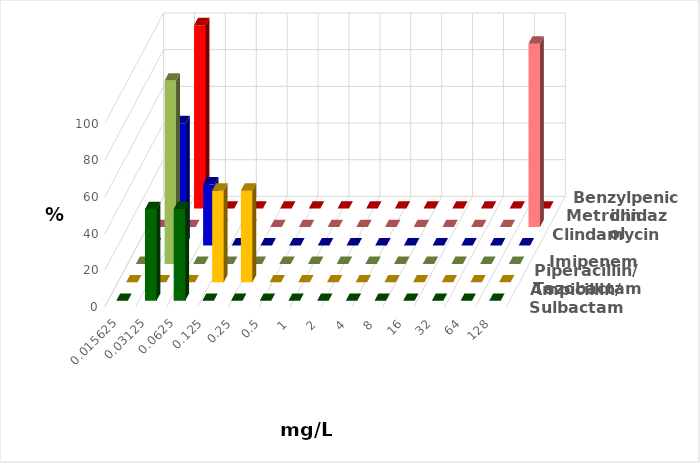
| Category | Ampicillin/ Sulbactam | Piperacillin/ Tazobactam | Imipenem | Clindamycin | Metronidazol | Benzylpenicillin |
|---|---|---|---|---|---|---|
| 0.015625 | 0 | 0 | 0 | 0 | 0 | 0 |
| 0.03125 | 50 | 0 | 100 | 66.667 | 0 | 100 |
| 0.0625 | 50 | 0 | 0 | 33.333 | 0 | 0 |
| 0.125 | 0 | 50 | 0 | 0 | 0 | 0 |
| 0.25 | 0 | 50 | 0 | 0 | 0 | 0 |
| 0.5 | 0 | 0 | 0 | 0 | 0 | 0 |
| 1.0 | 0 | 0 | 0 | 0 | 0 | 0 |
| 2.0 | 0 | 0 | 0 | 0 | 0 | 0 |
| 4.0 | 0 | 0 | 0 | 0 | 0 | 0 |
| 8.0 | 0 | 0 | 0 | 0 | 0 | 0 |
| 16.0 | 0 | 0 | 0 | 0 | 0 | 0 |
| 32.0 | 0 | 0 | 0 | 0 | 0 | 0 |
| 64.0 | 0 | 0 | 0 | 0 | 0 | 0 |
| 128.0 | 0 | 0 | 0 | 0 | 100 | 0 |